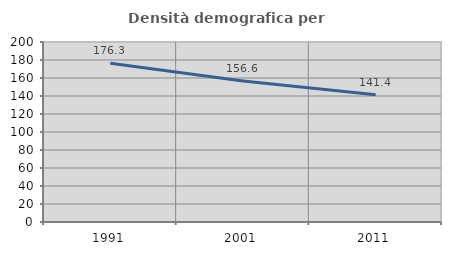
| Category | Densità demografica |
|---|---|
| 1991.0 | 176.317 |
| 2001.0 | 156.622 |
| 2011.0 | 141.429 |